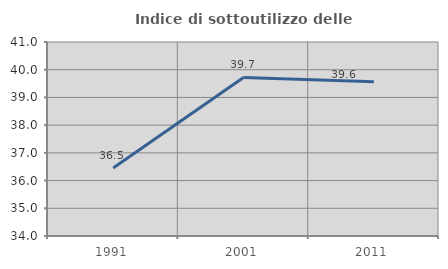
| Category | Indice di sottoutilizzo delle abitazioni  |
|---|---|
| 1991.0 | 36.453 |
| 2001.0 | 39.72 |
| 2011.0 | 39.565 |